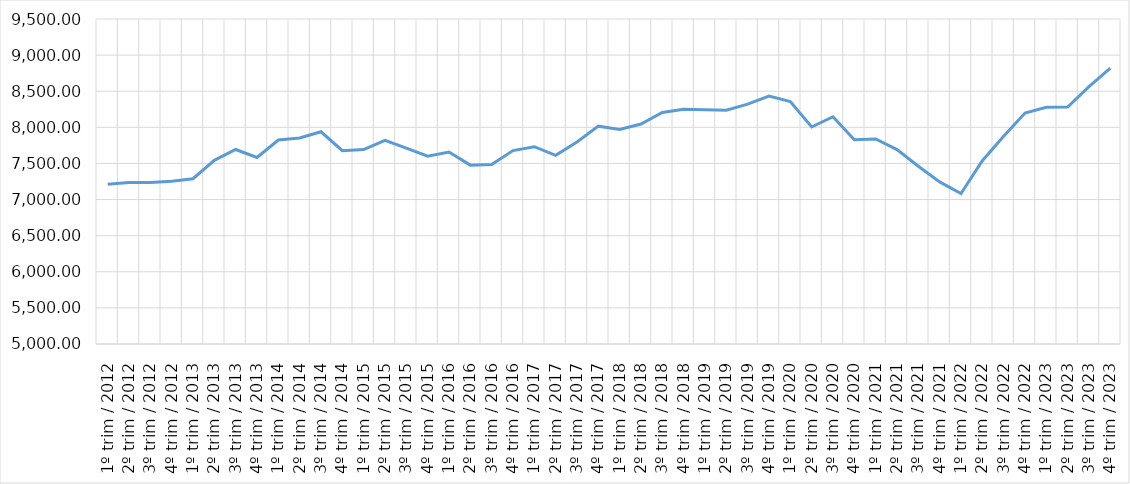
| Category | 10% superiores |
|---|---|
| 1º trim / 2012 | 7211.546 |
| 2º trim / 2012 | 7237.554 |
| 3º trim / 2012 | 7237.284 |
| 4º trim / 2012 | 7253.491 |
| 1º trim / 2013 | 7288.898 |
| 2º trim / 2013 | 7542.999 |
| 3º trim / 2013 | 7693.271 |
| 4º trim / 2013 | 7583.246 |
| 1º trim / 2014 | 7823.723 |
| 2º trim / 2014 | 7851.868 |
| 3º trim / 2014 | 7938.417 |
| 4º trim / 2014 | 7676.484 |
| 1º trim / 2015 | 7691.582 |
| 2º trim / 2015 | 7819.592 |
| 3º trim / 2015 | 7712.885 |
| 4º trim / 2015 | 7600.786 |
| 1º trim / 2016 | 7657.495 |
| 2º trim / 2016 | 7476.517 |
| 3º trim / 2016 | 7485.126 |
| 4º trim / 2016 | 7678.118 |
| 1º trim / 2017 | 7731.655 |
| 2º trim / 2017 | 7612.643 |
| 3º trim / 2017 | 7796.508 |
| 4º trim / 2017 | 8016.281 |
| 1º trim / 2018 | 7971.389 |
| 2º trim / 2018 | 8045.353 |
| 3º trim / 2018 | 8206.423 |
| 4º trim / 2018 | 8251.374 |
| 1º trim / 2019 | 8245.002 |
| 2º trim / 2019 | 8236.033 |
| 3º trim / 2019 | 8321.304 |
| 4º trim / 2019 | 8433.198 |
| 1º trim / 2020 | 8357.232 |
| 2º trim / 2020 | 8004.617 |
| 3º trim / 2020 | 8146.739 |
| 4º trim / 2020 | 7829.265 |
| 1º trim / 2021 | 7838.786 |
| 2º trim / 2021 | 7692.269 |
| 3º trim / 2021 | 7461.071 |
| 4º trim / 2021 | 7244.165 |
| 1º trim / 2022 | 7083.895 |
| 2º trim / 2022 | 7538.053 |
| 3º trim / 2022 | 7877.561 |
| 4º trim / 2022 | 8197.398 |
| 1º trim / 2023 | 8276.763 |
| 2º trim / 2023 | 8281.009 |
| 3º trim / 2023 | 8562.864 |
| 4º trim / 2023 | 8821.187 |